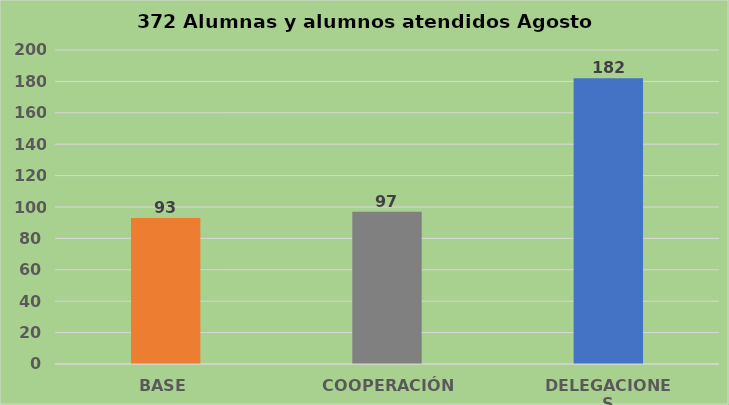
| Category | Series 0 |
|---|---|
| BASE | 93 |
| COOPERACIÓN | 97 |
| DELEGACIONES | 182 |